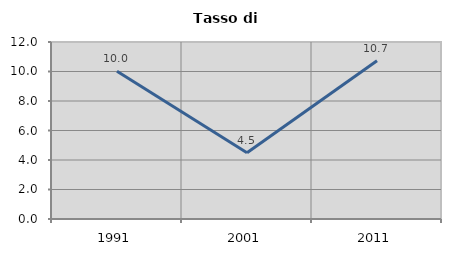
| Category | Tasso di disoccupazione   |
|---|---|
| 1991.0 | 10.024 |
| 2001.0 | 4.494 |
| 2011.0 | 10.727 |